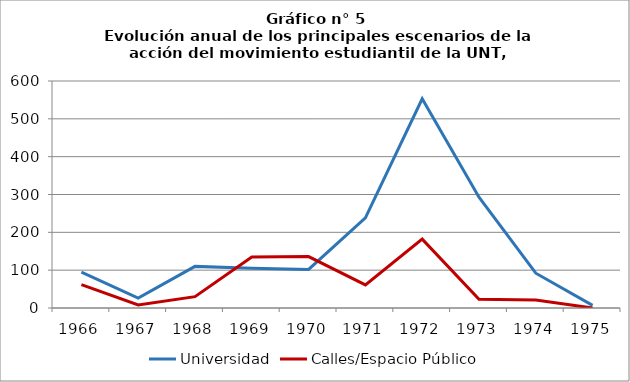
| Category | Universidad | Calles/Espacio Público |
|---|---|---|
| 1966.0 | 95 | 62 |
| 1967.0 | 26 | 8 |
| 1968.0 | 110 | 30 |
| 1969.0 | 105 | 135 |
| 1970.0 | 102 | 136 |
| 1971.0 | 238 | 61 |
| 1972.0 | 553 | 182 |
| 1973.0 | 293 | 23 |
| 1974.0 | 92 | 21 |
| 1975.0 | 7 | 0 |